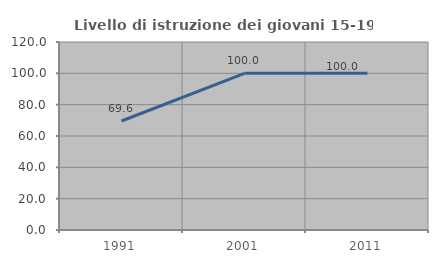
| Category | Livello di istruzione dei giovani 15-19 anni |
|---|---|
| 1991.0 | 69.565 |
| 2001.0 | 100 |
| 2011.0 | 100 |